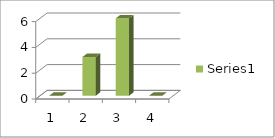
| Category | Series 0 |
|---|---|
| 0 | 0 |
| 1 | 3 |
| 2 | 6 |
| 3 | 0 |